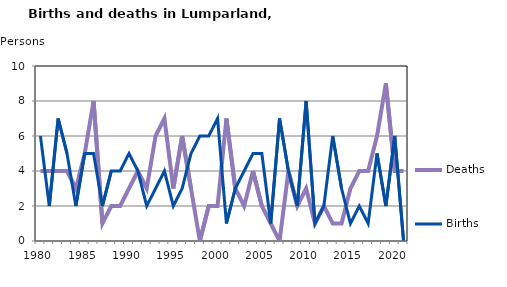
| Category | Deaths | Births |
|---|---|---|
| 1980.0 | 4 | 6 |
| 1981.0 | 4 | 2 |
| 1982.0 | 4 | 7 |
| 1983.0 | 4 | 5 |
| 1984.0 | 3 | 2 |
| 1985.0 | 5 | 5 |
| 1986.0 | 8 | 5 |
| 1987.0 | 1 | 2 |
| 1988.0 | 2 | 4 |
| 1989.0 | 2 | 4 |
| 1990.0 | 3 | 5 |
| 1991.0 | 4 | 4 |
| 1992.0 | 3 | 2 |
| 1993.0 | 6 | 3 |
| 1994.0 | 7 | 4 |
| 1995.0 | 3 | 2 |
| 1996.0 | 6 | 3 |
| 1997.0 | 3 | 5 |
| 1998.0 | 0 | 6 |
| 1999.0 | 2 | 6 |
| 2000.0 | 2 | 7 |
| 2001.0 | 7 | 1 |
| 2002.0 | 3 | 3 |
| 2003.0 | 2 | 4 |
| 2004.0 | 4 | 5 |
| 2005.0 | 2 | 5 |
| 2006.0 | 1 | 1 |
| 2007.0 | 0 | 7 |
| 2008.0 | 4 | 4 |
| 2009.0 | 2 | 2 |
| 2010.0 | 3 | 8 |
| 2011.0 | 1 | 1 |
| 2012.0 | 2 | 2 |
| 2013.0 | 1 | 6 |
| 2014.0 | 1 | 3 |
| 2015.0 | 3 | 1 |
| 2016.0 | 4 | 2 |
| 2017.0 | 4 | 1 |
| 2018.0 | 6 | 5 |
| 2019.0 | 9 | 2 |
| 2020.0 | 4 | 6 |
| 2021.0 | 4 | 0 |